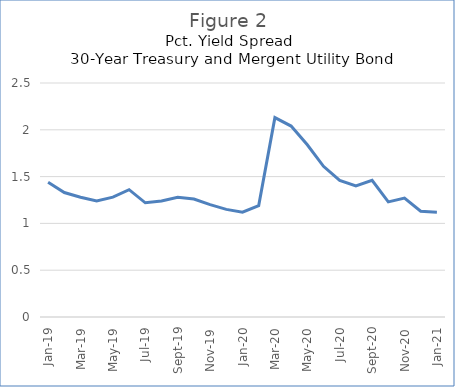
| Category | Series 0 |
|---|---|
| 2019-01-01 | 1.44 |
| 2019-02-01 | 1.33 |
| 2019-03-01 | 1.28 |
| 2019-04-01 | 1.24 |
| 2019-05-01 | 1.28 |
| 2019-06-01 | 1.36 |
| 2019-07-01 | 1.22 |
| 2019-08-01 | 1.24 |
| 2019-09-01 | 1.28 |
| 2019-10-01 | 1.26 |
| 2019-11-01 | 1.2 |
| 2019-12-01 | 1.15 |
| 2020-01-01 | 1.12 |
| 2020-02-01 | 1.19 |
| 2020-03-01 | 2.13 |
| 2020-04-01 | 2.04 |
| 2020-05-01 | 1.84 |
| 2020-06-01 | 1.61 |
| 2020-07-01 | 1.46 |
| 2020-08-01 | 1.4 |
| 2020-09-01 | 1.46 |
| 2020-10-01 | 1.23 |
| 2020-11-01 | 1.27 |
| 2020-12-01 | 1.13 |
| 2021-01-01 | 1.12 |